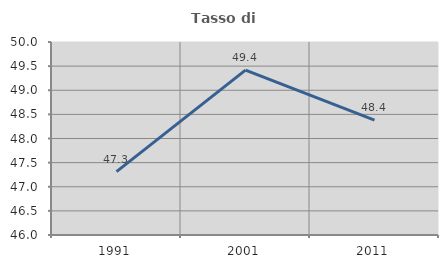
| Category | Tasso di occupazione   |
|---|---|
| 1991.0 | 47.313 |
| 2001.0 | 49.417 |
| 2011.0 | 48.379 |